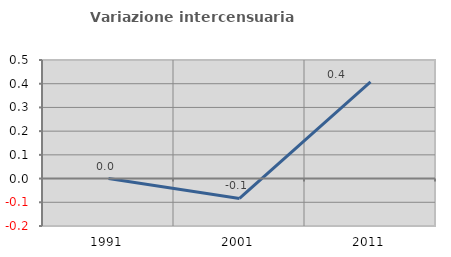
| Category | Variazione intercensuaria annua |
|---|---|
| 1991.0 | 0 |
| 2001.0 | -0.084 |
| 2011.0 | 0.408 |